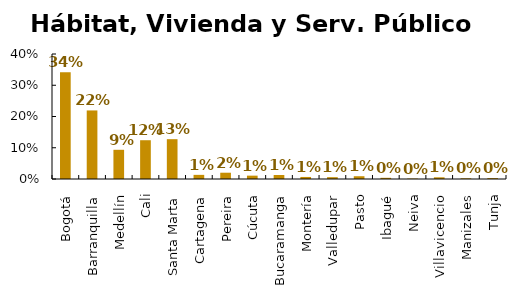
| Category | Hábitat, Vivienda y Serv. Público |
|---|---|
| Bogotá | 0.342 |
| Barranquilla | 0.219 |
| Medellín | 0.093 |
| Cali | 0.124 |
| Santa Marta | 0.127 |
| Cartagena | 0.013 |
| Pereira | 0.02 |
| Cúcuta | 0.011 |
| Bucaramanga | 0.013 |
| Montería | 0.007 |
| Valledupar | 0.006 |
| Pasto | 0.009 |
| Ibagué | 0.004 |
| Neiva | 0.001 |
| Villavicencio | 0.005 |
| Manizales | 0.002 |
| Tunja | 0.003 |